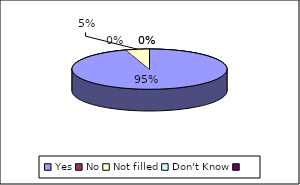
| Category | After the procedure were you given instructions about what to do. E.g. when to have stitches out |
|---|---|
| Yes | 58 |
| No | 0 |
| Not filled | 3 |
| Don't Know | 0 |